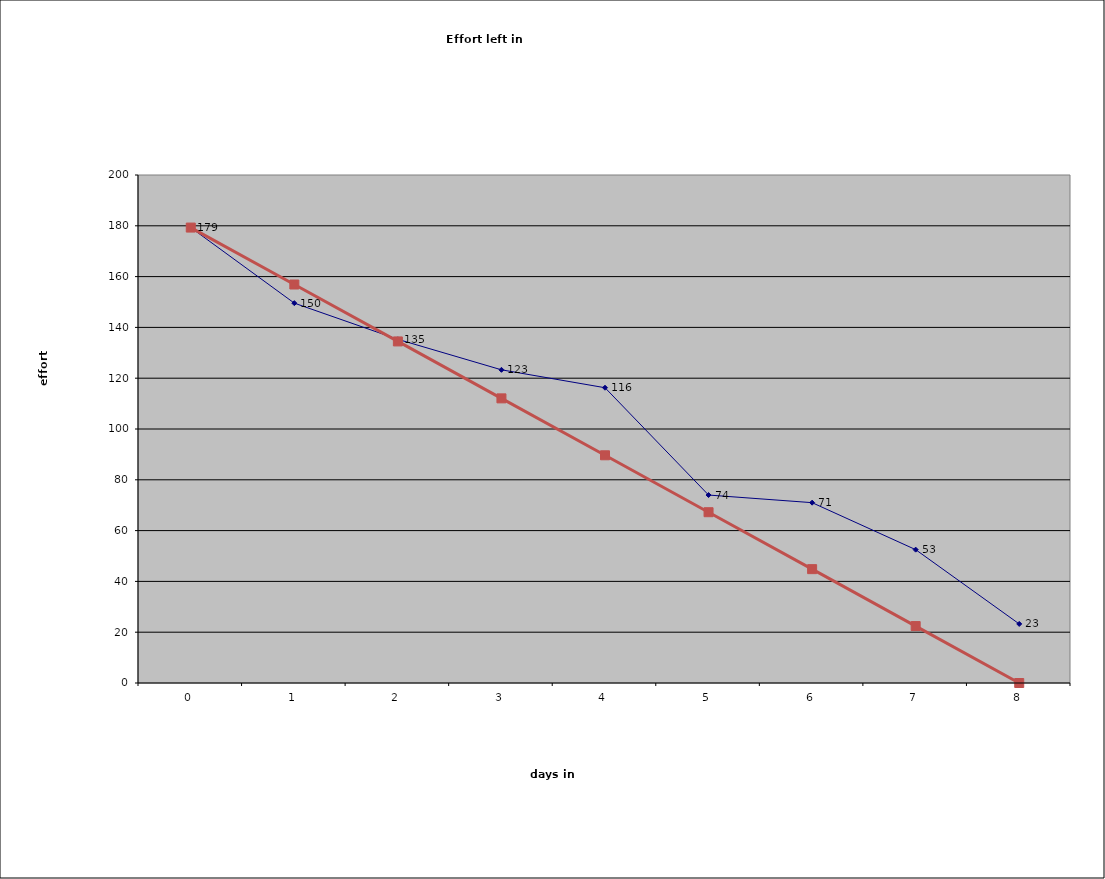
| Category | Effort left, ideal hours | Ideal Burndown |
|---|---|---|
| 0.0 | 179.3 | 179.3 |
| 1.0 | 149.55 | 156.888 |
| 2.0 | 135.3 | 134.475 |
| 3.0 | 123.3 | 112.063 |
| 4.0 | 116.25 | 89.65 |
| 5.0 | 74 | 67.238 |
| 6.0 | 71 | 44.825 |
| 7.0 | 52.5 | 22.413 |
| 8.0 | 23.25 | 0 |